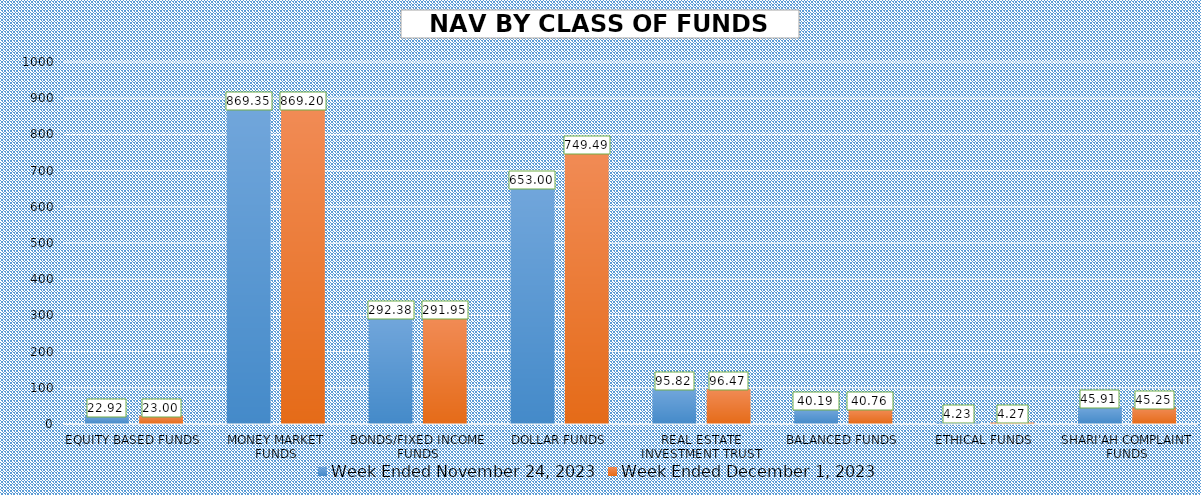
| Category | Week Ended November 24, 2023 | Week Ended December 1, 2023 |
|---|---|---|
| EQUITY BASED FUNDS | 22.918 | 23.003 |
| MONEY MARKET FUNDS | 869.351 | 869.197 |
| BONDS/FIXED INCOME FUNDS | 292.383 | 291.948 |
| DOLLAR FUNDS | 652.997 | 749.487 |
| REAL ESTATE INVESTMENT TRUST | 95.821 | 96.47 |
| BALANCED FUNDS | 40.186 | 40.757 |
| ETHICAL FUNDS | 4.234 | 4.266 |
| SHARI'AH COMPLAINT FUNDS | 45.908 | 45.254 |